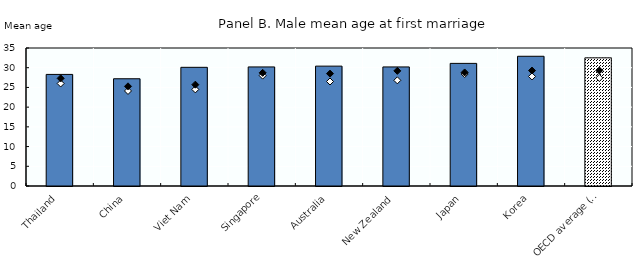
| Category | 2017 |
|---|---|
| Thailand | 28.3 |
| China | 27.2 |
| Viet Nam | 30.1 |
| Singapore | 30.2 |
| Australia | 30.4 |
| New Zealand | 30.2 |
| Japan | 31.1 |
| Korea | 32.9 |
| OECD average (e) | 32.5 |